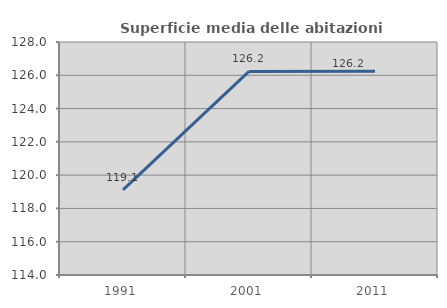
| Category | Superficie media delle abitazioni occupate |
|---|---|
| 1991.0 | 119.115 |
| 2001.0 | 126.234 |
| 2011.0 | 126.239 |